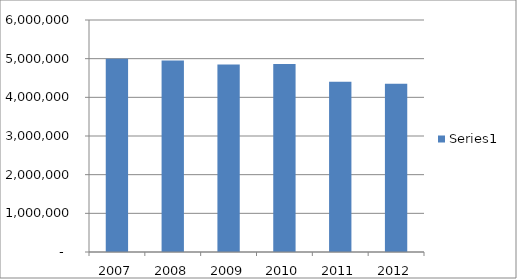
| Category | Series 0 |
|---|---|
| 2007.0 | 4997632.215 |
| 2008.0 | 4955440.215 |
| 2009.0 | 4850937.93 |
| 2010.0 | 4858921.89 |
| 2011.0 | 4400002.46 |
| 2012.0 | 4348098.12 |